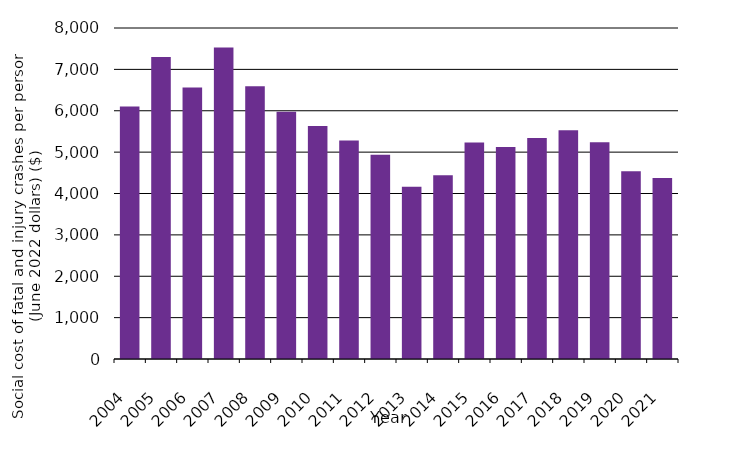
| Category | Social cost of road injury crashes per person (June 2022 dollars) ($) |
|---|---|
| 2004.0 | 6104.031 |
| 2005.0 | 7296.115 |
| 2006.0 | 6564.09 |
| 2007.0 | 7530.833 |
| 2008.0 | 6591.135 |
| 2009.0 | 5978.849 |
| 2010.0 | 5630.456 |
| 2011.0 | 5279.176 |
| 2012.0 | 4937.129 |
| 2013.0 | 4161.564 |
| 2014.0 | 4440.333 |
| 2015.0 | 5231.848 |
| 2016.0 | 5121.466 |
| 2017.0 | 5339.785 |
| 2018.0 | 5527.754 |
| 2019.0 | 5235.742 |
| 2020.0 | 4539.092 |
| 2021.0 | 4376.475 |